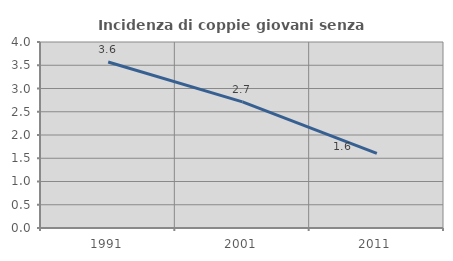
| Category | Incidenza di coppie giovani senza figli |
|---|---|
| 1991.0 | 3.569 |
| 2001.0 | 2.713 |
| 2011.0 | 1.606 |